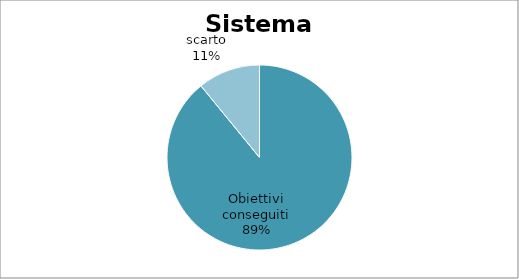
| Category | Series 0 |
|---|---|
| Obiettivi conseguiti | 89.091 |
| scarto | 10.909 |